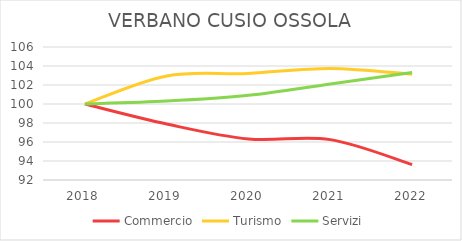
| Category | Commercio | Turismo | Servizi |
|---|---|---|---|
| 2018.0 | 100 | 100 | 100 |
| 2019.0 | 97.892 | 102.955 | 100.306 |
| 2020.0 | 96.323 | 103.22 | 100.917 |
| 2021.0 | 96.249 | 103.749 | 102.111 |
| 2022.0 | 93.626 | 103.132 | 103.306 |